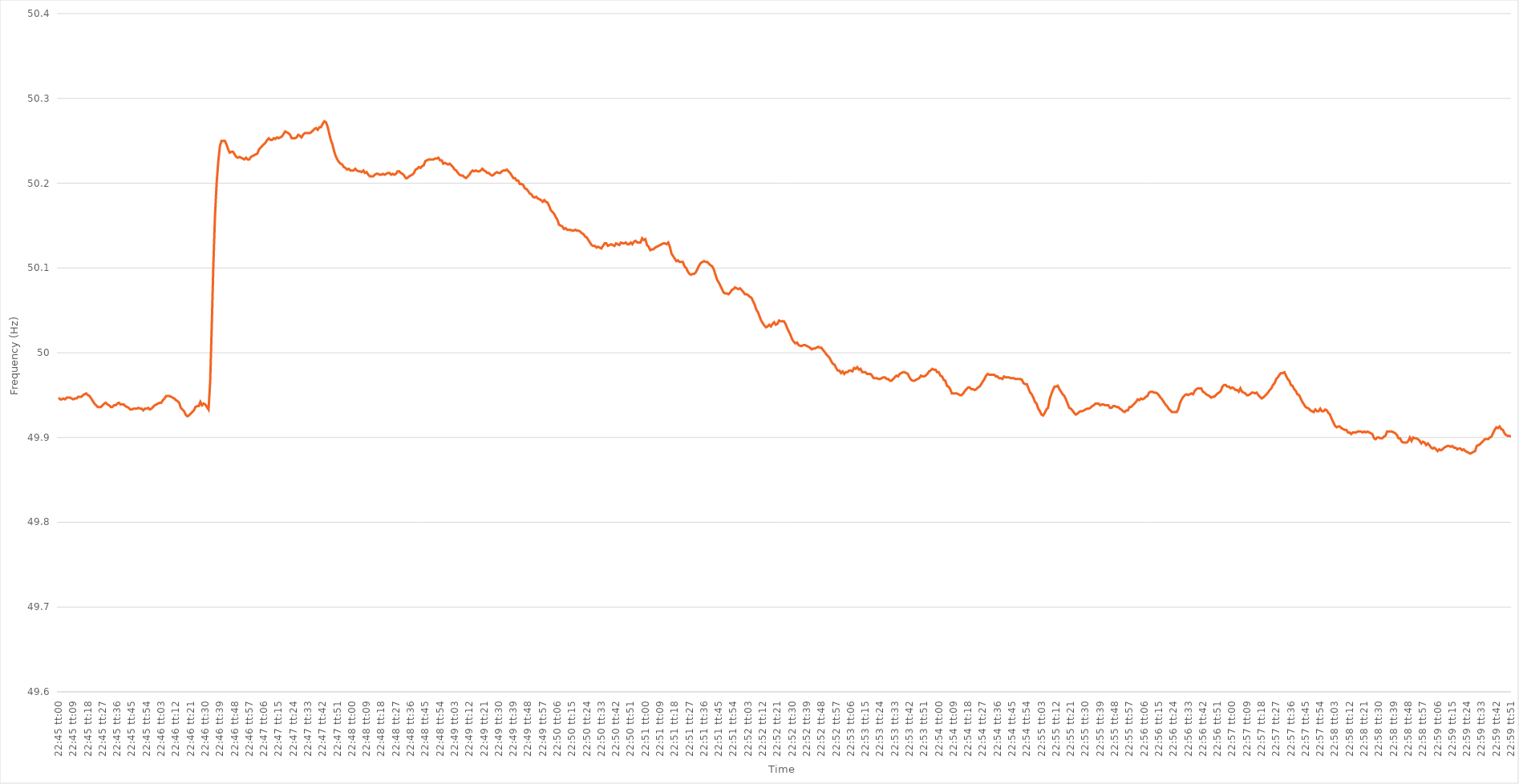
| Category | Series 0 |
|---|---|
| 0.9479166666666666 | 49.947 |
| 0.9479282407407408 | 49.945 |
| 0.9479398148148147 | 49.945 |
| 0.9479513888888889 | 49.946 |
| 0.947962962962963 | 49.945 |
| 0.947974537037037 | 49.947 |
| 0.9479861111111111 | 49.947 |
| 0.9479976851851851 | 49.947 |
| 0.9480092592592593 | 49.946 |
| 0.9480208333333334 | 49.945 |
| 0.9480324074074074 | 49.946 |
| 0.9480439814814815 | 49.946 |
| 0.9480555555555555 | 49.948 |
| 0.9480671296296297 | 49.948 |
| 0.9480787037037036 | 49.948 |
| 0.9480902777777778 | 49.95 |
| 0.9481018518518519 | 49.951 |
| 0.948113425925926 | 49.952 |
| 0.948125 | 49.95 |
| 0.948136574074074 | 49.949 |
| 0.9481481481481482 | 49.946 |
| 0.9481597222222223 | 49.943 |
| 0.9481712962962963 | 49.94 |
| 0.9481828703703704 | 49.938 |
| 0.9481944444444445 | 49.936 |
| 0.9482060185185185 | 49.936 |
| 0.9482175925925925 | 49.936 |
| 0.9482291666666667 | 49.938 |
| 0.9482407407407408 | 49.94 |
| 0.9482523148148148 | 49.941 |
| 0.9482638888888889 | 49.939 |
| 0.948275462962963 | 49.938 |
| 0.9482870370370371 | 49.936 |
| 0.948298611111111 | 49.936 |
| 0.9483101851851852 | 49.938 |
| 0.9483217592592593 | 49.938 |
| 0.9483333333333334 | 49.94 |
| 0.9483449074074074 | 49.941 |
| 0.9483564814814814 | 49.939 |
| 0.9483680555555556 | 49.939 |
| 0.9483796296296297 | 49.939 |
| 0.9483912037037037 | 49.937 |
| 0.9484027777777778 | 49.936 |
| 0.9484143518518519 | 49.935 |
| 0.9484259259259259 | 49.933 |
| 0.9484374999999999 | 49.933 |
| 0.9484490740740741 | 49.934 |
| 0.9484606481481482 | 49.934 |
| 0.9484722222222222 | 49.934 |
| 0.9484837962962963 | 49.935 |
| 0.9484953703703703 | 49.934 |
| 0.9485069444444445 | 49.934 |
| 0.9485185185185184 | 49.932 |
| 0.9485300925925926 | 49.934 |
| 0.9485416666666667 | 49.934 |
| 0.9485532407407408 | 49.935 |
| 0.9485648148148148 | 49.933 |
| 0.9485763888888888 | 49.934 |
| 0.948587962962963 | 49.936 |
| 0.9485995370370371 | 49.938 |
| 0.9486111111111111 | 49.939 |
| 0.9486226851851852 | 49.94 |
| 0.9486342592592593 | 49.941 |
| 0.9486458333333333 | 49.941 |
| 0.9486574074074073 | 49.944 |
| 0.9486689814814815 | 49.946 |
| 0.9486805555555556 | 49.949 |
| 0.9486921296296296 | 49.949 |
| 0.9487037037037037 | 49.949 |
| 0.9487152777777778 | 49.948 |
| 0.9487268518518519 | 49.947 |
| 0.9487384259259258 | 49.946 |
| 0.94875 | 49.944 |
| 0.9487615740740741 | 49.943 |
| 0.9487731481481482 | 49.941 |
| 0.9487847222222222 | 49.935 |
| 0.9487962962962962 | 49.933 |
| 0.9488078703703704 | 49.931 |
| 0.9488194444444445 | 49.927 |
| 0.9488310185185185 | 49.925 |
| 0.9488425925925926 | 49.926 |
| 0.9488541666666667 | 49.928 |
| 0.9488657407407407 | 49.93 |
| 0.9488773148148147 | 49.932 |
| 0.9488888888888889 | 49.936 |
| 0.948900462962963 | 49.937 |
| 0.948912037037037 | 49.937 |
| 0.9489236111111111 | 49.942 |
| 0.9489351851851852 | 49.938 |
| 0.9489467592592593 | 49.94 |
| 0.9489583333333332 | 49.939 |
| 0.9489699074074074 | 49.936 |
| 0.9489814814814815 | 49.933 |
| 0.9489930555555556 | 49.965 |
| 0.9490046296296296 | 50.033 |
| 0.9490162037037037 | 50.106 |
| 0.9490277777777778 | 50.163 |
| 0.949039351851852 | 50.201 |
| 0.9490509259259259 | 50.226 |
| 0.9490625 | 50.244 |
| 0.9490740740740741 | 50.25 |
| 0.9490856481481481 | 50.25 |
| 0.9490972222222221 | 50.25 |
| 0.9491087962962963 | 50.246 |
| 0.9491203703703704 | 50.24 |
| 0.9491319444444444 | 50.236 |
| 0.9491435185185185 | 50.237 |
| 0.9491550925925926 | 50.237 |
| 0.9491666666666667 | 50.234 |
| 0.9491782407407406 | 50.231 |
| 0.9491898148148148 | 50.23 |
| 0.9492013888888889 | 50.231 |
| 0.949212962962963 | 50.23 |
| 0.949224537037037 | 50.229 |
| 0.9492361111111111 | 50.228 |
| 0.9492476851851852 | 50.23 |
| 0.9492592592592594 | 50.228 |
| 0.9492708333333333 | 50.228 |
| 0.9492824074074074 | 50.231 |
| 0.9492939814814815 | 50.232 |
| 0.9493055555555556 | 50.233 |
| 0.9493171296296296 | 50.234 |
| 0.9493287037037037 | 50.235 |
| 0.9493402777777779 | 50.24 |
| 0.9493518518518519 | 50.242 |
| 0.9493634259259259 | 50.244 |
| 0.949375 | 50.246 |
| 0.9493865740740741 | 50.248 |
| 0.949398148148148 | 50.251 |
| 0.9494097222222222 | 50.253 |
| 0.9494212962962963 | 50.251 |
| 0.9494328703703704 | 50.251 |
| 0.9494444444444444 | 50.253 |
| 0.9494560185185185 | 50.252 |
| 0.9494675925925926 | 50.254 |
| 0.9494791666666668 | 50.253 |
| 0.9494907407407407 | 50.254 |
| 0.9495023148148148 | 50.255 |
| 0.9495138888888889 | 50.258 |
| 0.949525462962963 | 50.261 |
| 0.949537037037037 | 50.26 |
| 0.9495486111111111 | 50.259 |
| 0.9495601851851853 | 50.257 |
| 0.9495717592592593 | 50.253 |
| 0.9495833333333333 | 50.253 |
| 0.9495949074074074 | 50.253 |
| 0.9496064814814815 | 50.254 |
| 0.9496180555555555 | 50.257 |
| 0.9496296296296296 | 50.256 |
| 0.9496412037037038 | 50.254 |
| 0.9496527777777778 | 50.257 |
| 0.9496643518518518 | 50.259 |
| 0.9496759259259259 | 50.259 |
| 0.9496875 | 50.259 |
| 0.9496990740740742 | 50.259 |
| 0.9497106481481481 | 50.26 |
| 0.9497222222222222 | 50.262 |
| 0.9497337962962963 | 50.264 |
| 0.9497453703703704 | 50.265 |
| 0.9497569444444444 | 50.263 |
| 0.9497685185185185 | 50.266 |
| 0.9497800925925927 | 50.266 |
| 0.9497916666666667 | 50.27 |
| 0.9498032407407407 | 50.273 |
| 0.9498148148148148 | 50.272 |
| 0.9498263888888889 | 50.267 |
| 0.9498379629629629 | 50.259 |
| 0.949849537037037 | 50.251 |
| 0.9498611111111112 | 50.246 |
| 0.9498726851851852 | 50.238 |
| 0.9498842592592592 | 50.232 |
| 0.9498958333333333 | 50.228 |
| 0.9499074074074074 | 50.225 |
| 0.9499189814814816 | 50.223 |
| 0.9499305555555555 | 50.222 |
| 0.9499421296296297 | 50.219 |
| 0.9499537037037037 | 50.218 |
| 0.9499652777777778 | 50.216 |
| 0.9499768518518518 | 50.217 |
| 0.9499884259259259 | 50.215 |
| 0.9500000000000001 | 50.215 |
| 0.9500115740740741 | 50.215 |
| 0.9500231481481481 | 50.217 |
| 0.9500347222222222 | 50.215 |
| 0.9500462962962963 | 50.214 |
| 0.9500578703703703 | 50.214 |
| 0.9500694444444444 | 50.213 |
| 0.9500810185185186 | 50.215 |
| 0.9500925925925926 | 50.212 |
| 0.9501041666666666 | 50.213 |
| 0.9501157407407407 | 50.21 |
| 0.9501273148148148 | 50.208 |
| 0.950138888888889 | 50.208 |
| 0.9501504629629629 | 50.208 |
| 0.950162037037037 | 50.21 |
| 0.9501736111111111 | 50.211 |
| 0.9501851851851852 | 50.211 |
| 0.9501967592592592 | 50.21 |
| 0.9502083333333333 | 50.21 |
| 0.9502199074074075 | 50.211 |
| 0.9502314814814815 | 50.21 |
| 0.9502430555555555 | 50.211 |
| 0.9502546296296296 | 50.212 |
| 0.9502662037037037 | 50.212 |
| 0.9502777777777777 | 50.21 |
| 0.9502893518518518 | 50.211 |
| 0.950300925925926 | 50.21 |
| 0.9503125 | 50.211 |
| 0.950324074074074 | 50.214 |
| 0.9503356481481481 | 50.214 |
| 0.9503472222222222 | 50.212 |
| 0.9503587962962964 | 50.211 |
| 0.9503703703703703 | 50.209 |
| 0.9503819444444445 | 50.206 |
| 0.9503935185185185 | 50.206 |
| 0.9504050925925926 | 50.208 |
| 0.9504166666666666 | 50.209 |
| 0.9504282407407407 | 50.21 |
| 0.9504398148148149 | 50.212 |
| 0.9504513888888889 | 50.216 |
| 0.950462962962963 | 50.217 |
| 0.950474537037037 | 50.219 |
| 0.9504861111111111 | 50.218 |
| 0.9504976851851853 | 50.22 |
| 0.9505092592592592 | 50.221 |
| 0.9505208333333334 | 50.226 |
| 0.9505324074074074 | 50.227 |
| 0.9505439814814814 | 50.228 |
| 0.9505555555555555 | 50.228 |
| 0.9505671296296296 | 50.228 |
| 0.9505787037037038 | 50.228 |
| 0.9505902777777777 | 50.229 |
| 0.9506018518518519 | 50.229 |
| 0.9506134259259259 | 50.23 |
| 0.950625 | 50.227 |
| 0.950636574074074 | 50.227 |
| 0.9506481481481481 | 50.223 |
| 0.9506597222222223 | 50.224 |
| 0.9506712962962963 | 50.223 |
| 0.9506828703703704 | 50.222 |
| 0.9506944444444444 | 50.223 |
| 0.9507060185185185 | 50.221 |
| 0.9507175925925927 | 50.219 |
| 0.9507291666666666 | 50.216 |
| 0.9507407407407408 | 50.215 |
| 0.9507523148148148 | 50.212 |
| 0.950763888888889 | 50.21 |
| 0.9507754629629629 | 50.209 |
| 0.950787037037037 | 50.209 |
| 0.9507986111111112 | 50.207 |
| 0.9508101851851851 | 50.206 |
| 0.9508217592592593 | 50.208 |
| 0.9508333333333333 | 50.21 |
| 0.9508449074074075 | 50.213 |
| 0.9508564814814814 | 50.215 |
| 0.9508680555555555 | 50.214 |
| 0.9508796296296297 | 50.215 |
| 0.9508912037037037 | 50.214 |
| 0.9509027777777778 | 50.214 |
| 0.9509143518518518 | 50.215 |
| 0.950925925925926 | 50.217 |
| 0.9509375000000001 | 50.215 |
| 0.950949074074074 | 50.214 |
| 0.9509606481481482 | 50.212 |
| 0.9509722222222222 | 50.212 |
| 0.9509837962962964 | 50.21 |
| 0.9509953703703703 | 50.209 |
| 0.9510069444444444 | 50.21 |
| 0.9510185185185186 | 50.212 |
| 0.9510300925925925 | 50.213 |
| 0.9510416666666667 | 50.212 |
| 0.9510532407407407 | 50.212 |
| 0.9510648148148149 | 50.214 |
| 0.9510763888888888 | 50.215 |
| 0.9510879629629629 | 50.215 |
| 0.9510995370370371 | 50.216 |
| 0.9511111111111111 | 50.214 |
| 0.9511226851851852 | 50.212 |
| 0.9511342592592592 | 50.209 |
| 0.9511458333333334 | 50.206 |
| 0.9511574074074075 | 50.206 |
| 0.9511689814814814 | 50.203 |
| 0.9511805555555556 | 50.203 |
| 0.9511921296296296 | 50.199 |
| 0.9512037037037038 | 50.199 |
| 0.9512152777777777 | 50.198 |
| 0.9512268518518519 | 50.194 |
| 0.951238425925926 | 50.193 |
| 0.9512499999999999 | 50.191 |
| 0.9512615740740741 | 50.188 |
| 0.9512731481481481 | 50.187 |
| 0.9512847222222223 | 50.184 |
| 0.9512962962962962 | 50.183 |
| 0.9513078703703703 | 50.184 |
| 0.9513194444444445 | 50.182 |
| 0.9513310185185185 | 50.181 |
| 0.9513425925925926 | 50.18 |
| 0.9513541666666666 | 50.178 |
| 0.9513657407407408 | 50.18 |
| 0.9513773148148149 | 50.178 |
| 0.9513888888888888 | 50.177 |
| 0.951400462962963 | 50.173 |
| 0.951412037037037 | 50.168 |
| 0.9514236111111112 | 50.166 |
| 0.9514351851851851 | 50.164 |
| 0.9514467592592593 | 50.16 |
| 0.9514583333333334 | 50.157 |
| 0.9514699074074073 | 50.151 |
| 0.9514814814814815 | 50.15 |
| 0.9514930555555555 | 50.149 |
| 0.9515046296296297 | 50.146 |
| 0.9515162037037036 | 50.147 |
| 0.9515277777777778 | 50.145 |
| 0.9515393518518519 | 50.145 |
| 0.9515509259259259 | 50.145 |
| 0.9515625 | 50.144 |
| 0.951574074074074 | 50.144 |
| 0.9515856481481482 | 50.145 |
| 0.9515972222222223 | 50.144 |
| 0.9516087962962962 | 50.144 |
| 0.9516203703703704 | 50.143 |
| 0.9516319444444444 | 50.141 |
| 0.9516435185185186 | 50.14 |
| 0.9516550925925925 | 50.137 |
| 0.9516666666666667 | 50.136 |
| 0.9516782407407408 | 50.133 |
| 0.9516898148148147 | 50.13 |
| 0.9517013888888889 | 50.127 |
| 0.9517129629629629 | 50.126 |
| 0.9517245370370371 | 50.126 |
| 0.951736111111111 | 50.124 |
| 0.9517476851851852 | 50.125 |
| 0.9517592592592593 | 50.124 |
| 0.9517708333333333 | 50.123 |
| 0.9517824074074074 | 50.126 |
| 0.9517939814814814 | 50.129 |
| 0.9518055555555556 | 50.129 |
| 0.9518171296296297 | 50.126 |
| 0.9518287037037036 | 50.127 |
| 0.9518402777777778 | 50.128 |
| 0.9518518518518518 | 50.127 |
| 0.951863425925926 | 50.126 |
| 0.9518749999999999 | 50.129 |
| 0.9518865740740741 | 50.128 |
| 0.9518981481481482 | 50.127 |
| 0.9519097222222223 | 50.13 |
| 0.9519212962962963 | 50.129 |
| 0.9519328703703703 | 50.129 |
| 0.9519444444444445 | 50.13 |
| 0.9519560185185186 | 50.128 |
| 0.9519675925925926 | 50.128 |
| 0.9519791666666667 | 50.13 |
| 0.9519907407407407 | 50.128 |
| 0.9520023148148148 | 50.131 |
| 0.9520138888888888 | 50.132 |
| 0.952025462962963 | 50.13 |
| 0.9520370370370371 | 50.13 |
| 0.952048611111111 | 50.13 |
| 0.9520601851851852 | 50.135 |
| 0.9520717592592592 | 50.133 |
| 0.9520833333333334 | 50.134 |
| 0.9520949074074073 | 50.127 |
| 0.9521064814814815 | 50.125 |
| 0.9521180555555556 | 50.121 |
| 0.9521296296296297 | 50.122 |
| 0.9521412037037037 | 50.122 |
| 0.9521527777777777 | 50.124 |
| 0.9521643518518519 | 50.125 |
| 0.952175925925926 | 50.126 |
| 0.9521875 | 50.127 |
| 0.9521990740740741 | 50.128 |
| 0.9522106481481482 | 50.129 |
| 0.9522222222222222 | 50.129 |
| 0.9522337962962962 | 50.128 |
| 0.9522453703703704 | 50.13 |
| 0.9522569444444445 | 50.125 |
| 0.9522685185185185 | 50.117 |
| 0.9522800925925926 | 50.114 |
| 0.9522916666666666 | 50.111 |
| 0.9523032407407408 | 50.108 |
| 0.9523148148148147 | 50.109 |
| 0.9523263888888889 | 50.107 |
| 0.952337962962963 | 50.107 |
| 0.9523495370370371 | 50.107 |
| 0.9523611111111111 | 50.102 |
| 0.9523726851851851 | 50.1 |
| 0.9523842592592593 | 50.096 |
| 0.9523958333333334 | 50.093 |
| 0.9524074074074074 | 50.092 |
| 0.9524189814814815 | 50.093 |
| 0.9524305555555556 | 50.093 |
| 0.9524421296296296 | 50.095 |
| 0.9524537037037036 | 50.099 |
| 0.9524652777777778 | 50.103 |
| 0.9524768518518519 | 50.106 |
| 0.9524884259259259 | 50.107 |
| 0.9525 | 50.108 |
| 0.952511574074074 | 50.107 |
| 0.9525231481481482 | 50.107 |
| 0.9525347222222221 | 50.105 |
| 0.9525462962962963 | 50.103 |
| 0.9525578703703704 | 50.102 |
| 0.9525694444444445 | 50.098 |
| 0.9525810185185185 | 50.092 |
| 0.9525925925925925 | 50.086 |
| 0.9526041666666667 | 50.083 |
| 0.9526157407407408 | 50.079 |
| 0.9526273148148148 | 50.075 |
| 0.9526388888888889 | 50.071 |
| 0.952650462962963 | 50.07 |
| 0.952662037037037 | 50.07 |
| 0.952673611111111 | 50.069 |
| 0.9526851851851852 | 50.071 |
| 0.9526967592592593 | 50.074 |
| 0.9527083333333333 | 50.075 |
| 0.9527199074074074 | 50.077 |
| 0.9527314814814815 | 50.076 |
| 0.9527430555555556 | 50.075 |
| 0.9527546296296295 | 50.076 |
| 0.9527662037037037 | 50.074 |
| 0.9527777777777778 | 50.072 |
| 0.9527893518518519 | 50.069 |
| 0.9528009259259259 | 50.069 |
| 0.9528125 | 50.068 |
| 0.9528240740740741 | 50.066 |
| 0.9528356481481483 | 50.065 |
| 0.9528472222222222 | 50.061 |
| 0.9528587962962963 | 50.057 |
| 0.9528703703703704 | 50.051 |
| 0.9528819444444444 | 50.048 |
| 0.9528935185185184 | 50.043 |
| 0.9529050925925926 | 50.038 |
| 0.9529166666666667 | 50.035 |
| 0.9529282407407407 | 50.032 |
| 0.9529398148148148 | 50.03 |
| 0.9529513888888889 | 50.031 |
| 0.952962962962963 | 50.033 |
| 0.9529745370370369 | 50.031 |
| 0.9529861111111111 | 50.034 |
| 0.9529976851851852 | 50.036 |
| 0.9530092592592593 | 50.033 |
| 0.9530208333333333 | 50.034 |
| 0.9530324074074074 | 50.038 |
| 0.9530439814814815 | 50.037 |
| 0.9530555555555557 | 50.037 |
| 0.9530671296296296 | 50.037 |
| 0.9530787037037037 | 50.034 |
| 0.9530902777777778 | 50.029 |
| 0.9531018518518519 | 50.025 |
| 0.9531134259259259 | 50.021 |
| 0.953125 | 50.016 |
| 0.9531365740740741 | 50.013 |
| 0.9531481481481481 | 50.011 |
| 0.9531597222222222 | 50.012 |
| 0.9531712962962963 | 50.009 |
| 0.9531828703703704 | 50.008 |
| 0.9531944444444443 | 50.008 |
| 0.9532060185185185 | 50.009 |
| 0.9532175925925926 | 50.009 |
| 0.9532291666666667 | 50.008 |
| 0.9532407407407407 | 50.007 |
| 0.9532523148148148 | 50.006 |
| 0.9532638888888889 | 50.004 |
| 0.9532754629629631 | 50.005 |
| 0.953287037037037 | 50.005 |
| 0.9532986111111111 | 50.006 |
| 0.9533101851851852 | 50.007 |
| 0.9533217592592593 | 50.006 |
| 0.9533333333333333 | 50.006 |
| 0.9533449074074074 | 50.003 |
| 0.9533564814814816 | 50.001 |
| 0.9533680555555556 | 49.998 |
| 0.9533796296296296 | 49.996 |
| 0.9533912037037037 | 49.994 |
| 0.9534027777777778 | 49.99 |
| 0.9534143518518517 | 49.987 |
| 0.9534259259259259 | 49.986 |
| 0.9534375 | 49.982 |
| 0.9534490740740741 | 49.979 |
| 0.9534606481481481 | 49.979 |
| 0.9534722222222222 | 49.976 |
| 0.9534837962962963 | 49.978 |
| 0.9534953703703705 | 49.975 |
| 0.9535069444444444 | 49.977 |
| 0.9535185185185185 | 49.977 |
| 0.9535300925925926 | 49.979 |
| 0.9535416666666667 | 49.979 |
| 0.9535532407407407 | 49.978 |
| 0.9535648148148148 | 49.982 |
| 0.953576388888889 | 49.981 |
| 0.953587962962963 | 49.983 |
| 0.953599537037037 | 49.98 |
| 0.9536111111111111 | 49.981 |
| 0.9536226851851852 | 49.977 |
| 0.9536342592592592 | 49.977 |
| 0.9536458333333333 | 49.977 |
| 0.9536574074074075 | 49.975 |
| 0.9536689814814815 | 49.975 |
| 0.9536805555555555 | 49.975 |
| 0.9536921296296296 | 49.973 |
| 0.9537037037037037 | 49.97 |
| 0.9537152777777779 | 49.97 |
| 0.9537268518518518 | 49.97 |
| 0.953738425925926 | 49.969 |
| 0.95375 | 49.969 |
| 0.9537615740740741 | 49.97 |
| 0.9537731481481481 | 49.971 |
| 0.9537847222222222 | 49.971 |
| 0.9537962962962964 | 49.969 |
| 0.9538078703703704 | 49.969 |
| 0.9538194444444444 | 49.967 |
| 0.9538310185185185 | 49.967 |
| 0.9538425925925926 | 49.969 |
| 0.9538541666666666 | 49.971 |
| 0.9538657407407407 | 49.973 |
| 0.9538773148148149 | 49.972 |
| 0.9538888888888889 | 49.975 |
| 0.9539004629629629 | 49.976 |
| 0.953912037037037 | 49.977 |
| 0.9539236111111111 | 49.977 |
| 0.9539351851851853 | 49.976 |
| 0.9539467592592592 | 49.975 |
| 0.9539583333333334 | 49.971 |
| 0.9539699074074074 | 49.968 |
| 0.9539814814814815 | 49.967 |
| 0.9539930555555555 | 49.967 |
| 0.9540046296296296 | 49.968 |
| 0.9540162037037038 | 49.969 |
| 0.9540277777777778 | 49.97 |
| 0.9540393518518518 | 49.973 |
| 0.9540509259259259 | 49.972 |
| 0.9540625 | 49.972 |
| 0.954074074074074 | 49.973 |
| 0.9540856481481481 | 49.975 |
| 0.9540972222222223 | 49.978 |
| 0.9541087962962963 | 49.979 |
| 0.9541203703703703 | 49.981 |
| 0.9541319444444444 | 49.98 |
| 0.9541435185185185 | 49.98 |
| 0.9541550925925927 | 49.977 |
| 0.9541666666666666 | 49.977 |
| 0.9541782407407408 | 49.973 |
| 0.9541898148148148 | 49.972 |
| 0.954201388888889 | 49.968 |
| 0.9542129629629629 | 49.967 |
| 0.954224537037037 | 49.961 |
| 0.9542361111111112 | 49.96 |
| 0.9542476851851852 | 49.957 |
| 0.9542592592592593 | 49.952 |
| 0.9542708333333333 | 49.952 |
| 0.9542824074074074 | 49.952 |
| 0.9542939814814814 | 49.952 |
| 0.9543055555555555 | 49.951 |
| 0.9543171296296297 | 49.95 |
| 0.9543287037037037 | 49.95 |
| 0.9543402777777777 | 49.952 |
| 0.9543518518518518 | 49.955 |
| 0.9543634259259259 | 49.957 |
| 0.9543750000000001 | 49.959 |
| 0.954386574074074 | 49.959 |
| 0.9543981481481482 | 49.957 |
| 0.9544097222222222 | 49.957 |
| 0.9544212962962964 | 49.956 |
| 0.9544328703703703 | 49.957 |
| 0.9544444444444444 | 49.959 |
| 0.9544560185185186 | 49.96 |
| 0.9544675925925926 | 49.963 |
| 0.9544791666666667 | 49.966 |
| 0.9544907407407407 | 49.969 |
| 0.9545023148148148 | 49.973 |
| 0.954513888888889 | 49.975 |
| 0.9545254629629629 | 49.974 |
| 0.9545370370370371 | 49.974 |
| 0.9545486111111111 | 49.974 |
| 0.9545601851851853 | 49.974 |
| 0.9545717592592592 | 49.972 |
| 0.9545833333333333 | 49.972 |
| 0.9545949074074075 | 49.97 |
| 0.9546064814814814 | 49.97 |
| 0.9546180555555556 | 49.969 |
| 0.9546296296296296 | 49.972 |
| 0.9546412037037038 | 49.971 |
| 0.9546527777777777 | 49.971 |
| 0.9546643518518518 | 49.971 |
| 0.954675925925926 | 49.97 |
| 0.9546875 | 49.97 |
| 0.9546990740740741 | 49.97 |
| 0.9547106481481481 | 49.969 |
| 0.9547222222222222 | 49.969 |
| 0.9547337962962964 | 49.969 |
| 0.9547453703703703 | 49.969 |
| 0.9547569444444445 | 49.968 |
| 0.9547685185185185 | 49.964 |
| 0.9547800925925927 | 49.963 |
| 0.9547916666666666 | 49.963 |
| 0.9548032407407407 | 49.958 |
| 0.9548148148148149 | 49.953 |
| 0.9548263888888888 | 49.951 |
| 0.954837962962963 | 49.947 |
| 0.954849537037037 | 49.942 |
| 0.9548611111111112 | 49.94 |
| 0.9548726851851851 | 49.934 |
| 0.9548842592592592 | 49.931 |
| 0.9548958333333334 | 49.927 |
| 0.9549074074074074 | 49.926 |
| 0.9549189814814815 | 49.929 |
| 0.9549305555555555 | 49.933 |
| 0.9549421296296297 | 49.935 |
| 0.9549537037037038 | 49.945 |
| 0.9549652777777777 | 49.951 |
| 0.9549768518518519 | 49.956 |
| 0.9549884259259259 | 49.96 |
| 0.9550000000000001 | 49.96 |
| 0.955011574074074 | 49.961 |
| 0.9550231481481481 | 49.957 |
| 0.9550347222222223 | 49.954 |
| 0.9550462962962962 | 49.951 |
| 0.9550578703703704 | 49.949 |
| 0.9550694444444444 | 49.945 |
| 0.9550810185185186 | 49.94 |
| 0.9550925925925925 | 49.935 |
| 0.9551041666666666 | 49.934 |
| 0.9551157407407408 | 49.932 |
| 0.9551273148148148 | 49.929 |
| 0.9551388888888889 | 49.927 |
| 0.9551504629629629 | 49.928 |
| 0.9551620370370371 | 49.93 |
| 0.9551736111111112 | 49.931 |
| 0.9551851851851851 | 49.931 |
| 0.9551967592592593 | 49.932 |
| 0.9552083333333333 | 49.933 |
| 0.9552199074074075 | 49.934 |
| 0.9552314814814814 | 49.934 |
| 0.9552430555555556 | 49.935 |
| 0.9552546296296297 | 49.937 |
| 0.9552662037037036 | 49.938 |
| 0.9552777777777778 | 49.94 |
| 0.9552893518518518 | 49.94 |
| 0.955300925925926 | 49.94 |
| 0.9553124999999999 | 49.938 |
| 0.955324074074074 | 49.939 |
| 0.9553356481481482 | 49.939 |
| 0.9553472222222222 | 49.938 |
| 0.9553587962962963 | 49.938 |
| 0.9553703703703703 | 49.938 |
| 0.9553819444444445 | 49.935 |
| 0.9553935185185186 | 49.935 |
| 0.9554050925925925 | 49.937 |
| 0.9554166666666667 | 49.937 |
| 0.9554282407407407 | 49.936 |
| 0.9554398148148149 | 49.936 |
| 0.9554513888888888 | 49.934 |
| 0.955462962962963 | 49.933 |
| 0.9554745370370371 | 49.931 |
| 0.955486111111111 | 49.93 |
| 0.9554976851851852 | 49.932 |
| 0.9555092592592592 | 49.932 |
| 0.9555208333333334 | 49.936 |
| 0.9555324074074073 | 49.936 |
| 0.9555439814814815 | 49.938 |
| 0.9555555555555556 | 49.94 |
| 0.9555671296296296 | 49.942 |
| 0.9555787037037037 | 49.945 |
| 0.9555902777777777 | 49.944 |
| 0.9556018518518519 | 49.946 |
| 0.955613425925926 | 49.945 |
| 0.955625 | 49.946 |
| 0.9556365740740741 | 49.948 |
| 0.9556481481481481 | 49.949 |
| 0.9556597222222223 | 49.953 |
| 0.9556712962962962 | 49.954 |
| 0.9556828703703704 | 49.954 |
| 0.9556944444444445 | 49.953 |
| 0.9557060185185186 | 49.953 |
| 0.9557175925925926 | 49.952 |
| 0.9557291666666666 | 49.95 |
| 0.9557407407407408 | 49.947 |
| 0.9557523148148147 | 49.945 |
| 0.9557638888888889 | 49.942 |
| 0.955775462962963 | 49.939 |
| 0.955787037037037 | 49.937 |
| 0.9557986111111111 | 49.934 |
| 0.9558101851851851 | 49.932 |
| 0.9558217592592593 | 49.93 |
| 0.9558333333333334 | 49.93 |
| 0.9558449074074074 | 49.93 |
| 0.9558564814814815 | 49.93 |
| 0.9558680555555555 | 49.934 |
| 0.9558796296296297 | 49.941 |
| 0.9558912037037036 | 49.945 |
| 0.9559027777777778 | 49.948 |
| 0.9559143518518519 | 49.95 |
| 0.955925925925926 | 49.951 |
| 0.9559375 | 49.95 |
| 0.955949074074074 | 49.951 |
| 0.9559606481481482 | 49.952 |
| 0.9559722222222223 | 49.951 |
| 0.9559837962962963 | 49.955 |
| 0.9559953703703704 | 49.957 |
| 0.9560069444444445 | 49.958 |
| 0.9560185185185185 | 49.958 |
| 0.9560300925925925 | 49.958 |
| 0.9560416666666667 | 49.954 |
| 0.9560532407407408 | 49.953 |
| 0.9560648148148148 | 49.951 |
| 0.9560763888888889 | 49.95 |
| 0.956087962962963 | 49.949 |
| 0.9560995370370371 | 49.947 |
| 0.956111111111111 | 49.948 |
| 0.9561226851851852 | 49.948 |
| 0.9561342592592593 | 49.95 |
| 0.9561458333333334 | 49.952 |
| 0.9561574074074074 | 49.953 |
| 0.9561689814814814 | 49.955 |
| 0.9561805555555556 | 49.96 |
| 0.9561921296296297 | 49.962 |
| 0.9562037037037037 | 49.962 |
| 0.9562152777777778 | 49.96 |
| 0.9562268518518519 | 49.96 |
| 0.9562384259259259 | 49.958 |
| 0.9562499999999999 | 49.959 |
| 0.9562615740740741 | 49.958 |
| 0.9562731481481482 | 49.956 |
| 0.9562847222222222 | 49.956 |
| 0.9562962962962963 | 49.954 |
| 0.9563078703703703 | 49.958 |
| 0.9563194444444445 | 49.954 |
| 0.9563310185185184 | 49.953 |
| 0.9563425925925926 | 49.952 |
| 0.9563541666666667 | 49.95 |
| 0.9563657407407408 | 49.95 |
| 0.9563773148148148 | 49.951 |
| 0.9563888888888888 | 49.953 |
| 0.956400462962963 | 49.953 |
| 0.9564120370370371 | 49.952 |
| 0.9564236111111111 | 49.953 |
| 0.9564351851851852 | 49.95 |
| 0.9564467592592593 | 49.948 |
| 0.9564583333333333 | 49.946 |
| 0.9564699074074073 | 49.947 |
| 0.9564814814814815 | 49.949 |
| 0.9564930555555556 | 49.951 |
| 0.9565046296296296 | 49.953 |
| 0.9565162037037037 | 49.956 |
| 0.9565277777777778 | 49.958 |
| 0.9565393518518519 | 49.962 |
| 0.9565509259259258 | 49.964 |
| 0.9565625 | 49.969 |
| 0.9565740740740741 | 49.971 |
| 0.9565856481481482 | 49.974 |
| 0.9565972222222222 | 49.976 |
| 0.9566087962962962 | 49.976 |
| 0.9566203703703704 | 49.977 |
| 0.9566319444444445 | 49.973 |
| 0.9566435185185185 | 49.969 |
| 0.9566550925925926 | 49.967 |
| 0.9566666666666667 | 49.962 |
| 0.9566782407407407 | 49.961 |
| 0.9566898148148147 | 49.957 |
| 0.9567013888888889 | 49.955 |
| 0.956712962962963 | 49.951 |
| 0.956724537037037 | 49.95 |
| 0.9567361111111111 | 49.946 |
| 0.9567476851851852 | 49.942 |
| 0.9567592592592593 | 49.939 |
| 0.9567708333333332 | 49.936 |
| 0.9567824074074074 | 49.935 |
| 0.9567939814814815 | 49.934 |
| 0.9568055555555556 | 49.932 |
| 0.9568171296296296 | 49.931 |
| 0.9568287037037037 | 49.93 |
| 0.9568402777777778 | 49.933 |
| 0.956851851851852 | 49.931 |
| 0.9568634259259259 | 49.931 |
| 0.956875 | 49.934 |
| 0.9568865740740741 | 49.931 |
| 0.9568981481481481 | 49.931 |
| 0.9569097222222221 | 49.933 |
| 0.9569212962962963 | 49.932 |
| 0.9569328703703704 | 49.929 |
| 0.9569444444444444 | 49.927 |
| 0.9569560185185185 | 49.922 |
| 0.9569675925925926 | 49.918 |
| 0.9569791666666667 | 49.914 |
| 0.9569907407407406 | 49.912 |
| 0.9570023148148148 | 49.913 |
| 0.9570138888888889 | 49.913 |
| 0.957025462962963 | 49.911 |
| 0.957037037037037 | 49.91 |
| 0.9570486111111111 | 49.909 |
| 0.9570601851851852 | 49.909 |
| 0.9570717592592594 | 49.906 |
| 0.9570833333333333 | 49.906 |
| 0.9570949074074074 | 49.904 |
| 0.9571064814814815 | 49.906 |
| 0.9571180555555556 | 49.906 |
| 0.9571296296296296 | 49.906 |
| 0.9571412037037037 | 49.907 |
| 0.9571527777777779 | 49.907 |
| 0.9571643518518519 | 49.907 |
| 0.9571759259259259 | 49.906 |
| 0.9571875 | 49.907 |
| 0.9571990740740741 | 49.906 |
| 0.957210648148148 | 49.907 |
| 0.9572222222222222 | 49.906 |
| 0.9572337962962963 | 49.905 |
| 0.9572453703703704 | 49.904 |
| 0.9572569444444444 | 49.899 |
| 0.9572685185185185 | 49.898 |
| 0.9572800925925926 | 49.9 |
| 0.9572916666666668 | 49.9 |
| 0.9573032407407407 | 49.899 |
| 0.9573148148148148 | 49.899 |
| 0.9573263888888889 | 49.901 |
| 0.957337962962963 | 49.902 |
| 0.957349537037037 | 49.907 |
| 0.9573611111111111 | 49.907 |
| 0.9573726851851853 | 49.907 |
| 0.9573842592592593 | 49.907 |
| 0.9573958333333333 | 49.906 |
| 0.9574074074074074 | 49.905 |
| 0.9574189814814815 | 49.903 |
| 0.9574305555555555 | 49.899 |
| 0.9574421296296296 | 49.899 |
| 0.9574537037037038 | 49.895 |
| 0.9574652777777778 | 49.894 |
| 0.9574768518518518 | 49.894 |
| 0.9574884259259259 | 49.894 |
| 0.9575 | 49.896 |
| 0.9575115740740742 | 49.9 |
| 0.9575231481481481 | 49.896 |
| 0.9575347222222222 | 49.9 |
| 0.9575462962962963 | 49.899 |
| 0.9575578703703704 | 49.899 |
| 0.9575694444444444 | 49.898 |
| 0.9575810185185185 | 49.896 |
| 0.9575925925925927 | 49.893 |
| 0.9576041666666667 | 49.895 |
| 0.9576157407407407 | 49.894 |
| 0.9576273148148148 | 49.891 |
| 0.9576388888888889 | 49.893 |
| 0.9576504629629629 | 49.891 |
| 0.957662037037037 | 49.888 |
| 0.9576736111111112 | 49.887 |
| 0.9576851851851852 | 49.888 |
| 0.9576967592592592 | 49.886 |
| 0.9577083333333333 | 49.884 |
| 0.9577199074074074 | 49.886 |
| 0.9577314814814816 | 49.885 |
| 0.9577430555555555 | 49.886 |
| 0.9577546296296297 | 49.888 |
| 0.9577662037037037 | 49.889 |
| 0.9577777777777778 | 49.89 |
| 0.9577893518518518 | 49.89 |
| 0.9578009259259259 | 49.889 |
| 0.9578125000000001 | 49.89 |
| 0.9578240740740741 | 49.888 |
| 0.9578356481481481 | 49.888 |
| 0.9578472222222222 | 49.886 |
| 0.9578587962962963 | 49.887 |
| 0.9578703703703703 | 49.887 |
| 0.9578819444444444 | 49.885 |
| 0.9578935185185186 | 49.886 |
| 0.9579050925925926 | 49.884 |
| 0.9579166666666666 | 49.883 |
| 0.9579282407407407 | 49.882 |
| 0.9579398148148148 | 49.881 |
| 0.957951388888889 | 49.882 |
| 0.9579629629629629 | 49.883 |
| 0.957974537037037 | 49.884 |
| 0.9579861111111111 | 49.89 |
| 0.9579976851851852 | 49.891 |
| 0.9580092592592592 | 49.892 |
| 0.9580208333333333 | 49.894 |
| 0.9580324074074075 | 49.896 |
| 0.9580439814814815 | 49.898 |
| 0.9580555555555555 | 49.898 |
| 0.9580671296296296 | 49.898 |
| 0.9580787037037037 | 49.9 |
| 0.9580902777777777 | 49.901 |
| 0.9581018518518518 | 49.905 |
| 0.958113425925926 | 49.909 |
| 0.958125 | 49.912 |
| 0.958136574074074 | 49.911 |
| 0.9581481481481481 | 49.913 |
| 0.9581597222222222 | 49.91 |
| 0.9581712962962964 | 49.909 |
| 0.9581828703703703 | 49.905 |
| 0.9581944444444445 | 49.903 |
| 0.9582060185185185 | 49.902 |
| 0.9582175925925926 | 49.902 |
| 0.9582291666666666 | 49.901 |